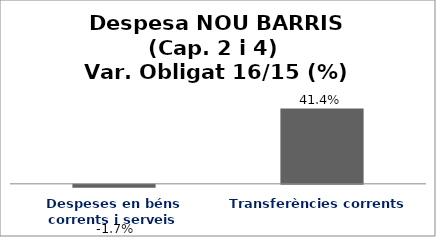
| Category | Series 0 |
|---|---|
| Despeses en béns corrents i serveis | -0.017 |
| Transferències corrents | 0.414 |